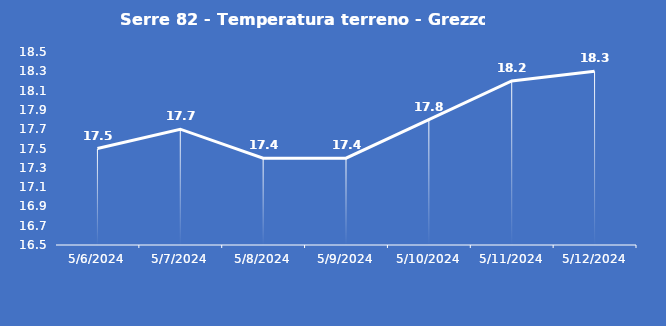
| Category | Serre 82 - Temperatura terreno - Grezzo (°C) |
|---|---|
| 5/6/24 | 17.5 |
| 5/7/24 | 17.7 |
| 5/8/24 | 17.4 |
| 5/9/24 | 17.4 |
| 5/10/24 | 17.8 |
| 5/11/24 | 18.2 |
| 5/12/24 | 18.3 |